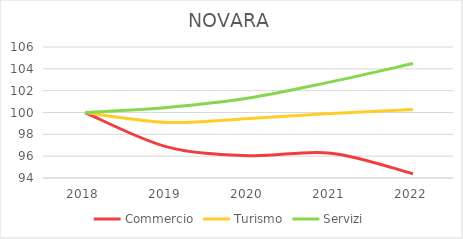
| Category | Commercio | Turismo | Servizi |
|---|---|---|---|
| 2018.0 | 100 | 100 | 100 |
| 2019.0 | 96.849 | 99.091 | 100.461 |
| 2020.0 | 96.042 | 99.455 | 101.324 |
| 2021.0 | 96.275 | 99.909 | 102.808 |
| 2022.0 | 94.395 | 100.273 | 104.483 |